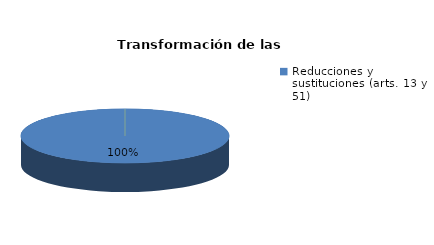
| Category | Series 0 |
|---|---|
| Reducciones y sustituciones (arts. 13 y 51) | 17 |
| Por quebrantamiento (art. 50.2) | 0 |
| Cancelaciones anticipadas | 0 |
| Traslado a Centros Penitenciarios | 0 |
| Conversión internamientos en cerrados (art. 51.2) | 0 |